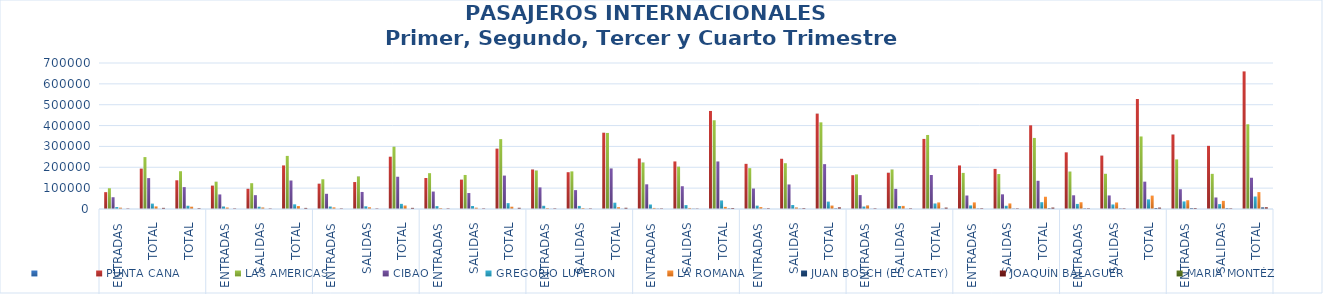
| Category | Series 0 | PUNTA CANA | LAS AMERICAS | CIBAO | GREGORIO LUPERON | LA ROMANA | JUAN BOSCH (EL CATEY) | JOAQUÍN BALAGUER | MARIA MONTÉZ |
|---|---|---|---|---|---|---|---|---|---|
| 0 |  | 80766 | 99599 | 56459 | 9387 | 6229 | 101 | 2444 | 1 |
| 1 |  | 193484 | 248929 | 148126 | 25516 | 12652 | 401 | 5396 | 1 |
| 2 |  | 137678 | 181138 | 104888 | 15450 | 10848 | 89 | 3876 | 9 |
| 3 |  | 112019 | 130720 | 69918 | 11685 | 7250 | 85 | 2782 | 10 |
| 4 |  | 96923 | 123770 | 66368 | 10789 | 6983 | 74 | 2452 | 7 |
| 5 |  | 208942 | 254490 | 136286 | 22474 | 14233 | 159 | 5234 | 17 |
| 6 |  | 121328 | 142669 | 72778 | 11533 | 7945 | 64 | 2763 | 1 |
| 7 |  | 129274 | 155709 | 81719 | 13054 | 8377 | 68 | 2626 | 2 |
| 8 |  | 250602 | 298378 | 154497 | 24587 | 16322 | 132 | 5389 | 3 |
| 9 |  | 148641 | 171850 | 83336 | 13914 | 4624 | 70 | 2864 | 4 |
| 10 |  | 140691 | 163171 | 76568 | 14335 | 6176 | 75 | 2851 | 5 |
| 11 |  | 289332 | 335021 | 159904 | 28249 | 10800 | 145 | 5715 | 9 |
| 12 |  | 189262 | 184184 | 103620 | 15266 | 4128 | 521 | 3030 | 3 |
| 13 |  | 176433 | 180423 | 90512 | 14754 | 4590 | 364 | 2758 | 2 |
| 14 |  | 365695 | 364607 | 194132 | 30020 | 8718 | 885 | 5788 | 5 |
| 15 |  | 242002 | 222633 | 118360 | 21651 | 5116 | 1349 | 2740 | 4 |
| 16 |  | 228051 | 202824 | 109189 | 18858 | 5013 | 1150 | 1954 | 2 |
| 17 |  | 470053 | 425457 | 227549 | 40509 | 10129 | 2499 | 4694 | 6 |
| 18 |  | 216475 | 195866 | 97788 | 15870 | 9106 | 1279 | 3539 | 0 |
| 19 |  | 240713 | 219625 | 117293 | 19223 | 7059 | 1397 | 4167 | 0 |
| 20 |  | 457188 | 415491 | 215081 | 35093 | 16165 | 2676 | 7706 | 0 |
| 21 |  | 162130 | 165953 | 66736 | 11533 | 16714 | 708 | 3254 | 0 |
| 22 |  | 173866 | 189006 | 96390 | 14519 | 14859 | 646 | 3236 | 0 |
| 23 |  | 335996 | 354959 | 163126 | 26052 | 31573 | 1354 | 6490 | 0 |
| 24 |  | 208889 | 173022 | 64753 | 17334 | 31740 | 1782 | 3604 | 1 |
| 25 |  | 192291 | 167654 | 70412 | 15362 | 26736 | 1566 | 3019 | 0 |
| 26 |  | 401180 | 340676 | 135165 | 32696 | 58476 | 3348 | 6623 | 1 |
| 27 |  | 271643 | 179171 | 65747 | 24348 | 32430 | 2591 | 3227 | 1 |
| 28 |  | 255889 | 168635 | 65080 | 21861 | 31395 | 2115 | 3255 | 0 |
| 29 |  | 527532 | 347806 | 130827 | 46209 | 63825 | 4706 | 6482 | 1 |
| 30 |  | 357011 | 237871 | 94799 | 36404 | 42130 | 4194 | 4873 | 1 |
| 31 |  | 302733 | 168386 | 54874 | 23518 | 38934 | 3481 | 3198 | 3 |
| 32 |  | 659744 | 406257 | 149673 | 59922 | 81064 | 7675 | 8071 | 4 |